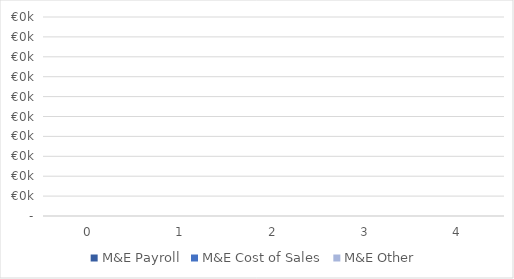
| Category | M&E Payroll | M&E Cost of Sales | M&E Other |
|---|---|---|---|
| 0.0 | 0 | 0 | 0 |
| 1.0 | 0 | 0 | 0 |
| 2.0 | 0 | 0 | 0 |
| 3.0 | 0 | 0 | 0 |
| 4.0 | 0 | 0 | 0 |